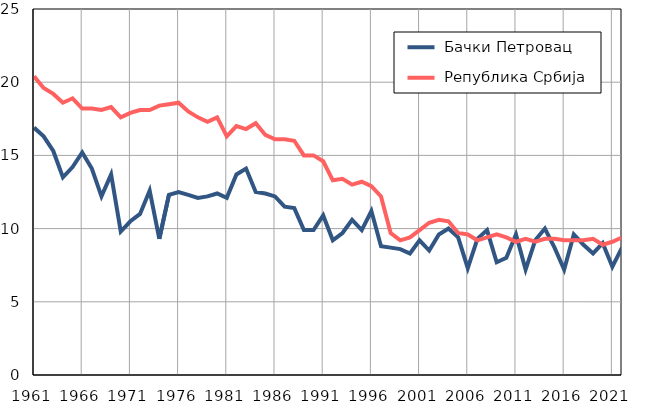
| Category |  Бачки Петровац |  Република Србија |
|---|---|---|
| 1961.0 | 16.9 | 20.4 |
| 1962.0 | 16.3 | 19.6 |
| 1963.0 | 15.3 | 19.2 |
| 1964.0 | 13.5 | 18.6 |
| 1965.0 | 14.2 | 18.9 |
| 1966.0 | 15.2 | 18.2 |
| 1967.0 | 14.1 | 18.2 |
| 1968.0 | 12.2 | 18.1 |
| 1969.0 | 13.7 | 18.3 |
| 1970.0 | 9.8 | 17.6 |
| 1971.0 | 10.5 | 17.9 |
| 1972.0 | 11 | 18.1 |
| 1973.0 | 12.6 | 18.1 |
| 1974.0 | 9.3 | 18.4 |
| 1975.0 | 12.3 | 18.5 |
| 1976.0 | 12.5 | 18.6 |
| 1977.0 | 12.3 | 18 |
| 1978.0 | 12.1 | 17.6 |
| 1979.0 | 12.2 | 17.3 |
| 1980.0 | 12.4 | 17.6 |
| 1981.0 | 12.1 | 16.3 |
| 1982.0 | 13.7 | 17 |
| 1983.0 | 14.1 | 16.8 |
| 1984.0 | 12.5 | 17.2 |
| 1985.0 | 12.4 | 16.4 |
| 1986.0 | 12.2 | 16.1 |
| 1987.0 | 11.5 | 16.1 |
| 1988.0 | 11.4 | 16 |
| 1989.0 | 9.9 | 15 |
| 1990.0 | 9.9 | 15 |
| 1991.0 | 10.9 | 14.6 |
| 1992.0 | 9.2 | 13.3 |
| 1993.0 | 9.7 | 13.4 |
| 1994.0 | 10.6 | 13 |
| 1995.0 | 9.9 | 13.2 |
| 1996.0 | 11.2 | 12.9 |
| 1997.0 | 8.8 | 12.2 |
| 1998.0 | 8.7 | 9.7 |
| 1999.0 | 8.6 | 9.2 |
| 2000.0 | 8.3 | 9.4 |
| 2001.0 | 9.2 | 9.9 |
| 2002.0 | 8.5 | 10.4 |
| 2003.0 | 9.6 | 10.6 |
| 2004.0 | 10 | 10.5 |
| 2005.0 | 9.4 | 9.7 |
| 2006.0 | 7.3 | 9.6 |
| 2007.0 | 9.3 | 9.2 |
| 2008.0 | 9.9 | 9.4 |
| 2009.0 | 7.7 | 9.6 |
| 2010.0 | 8 | 9.4 |
| 2011.0 | 9.6 | 9.1 |
| 2012.0 | 7.2 | 9.3 |
| 2013.0 | 9.2 | 9.1 |
| 2014.0 | 10 | 9.3 |
| 2015.0 | 8.7 | 9.3 |
| 2016.0 | 7.2 | 9.2 |
| 2017.0 | 9.6 | 9.2 |
| 2018.0 | 8.9 | 9.2 |
| 2019.0 | 8.3 | 9.3 |
| 2020.0 | 9 | 8.9 |
| 2021.0 | 7.4 | 9.1 |
| 2022.0 | 8.7 | 9.4 |